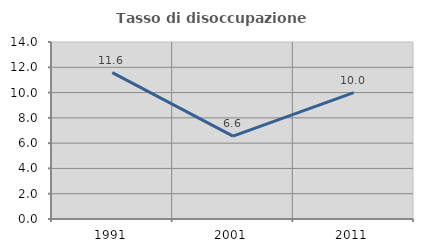
| Category | Tasso di disoccupazione giovanile  |
|---|---|
| 1991.0 | 11.579 |
| 2001.0 | 6.557 |
| 2011.0 | 10 |